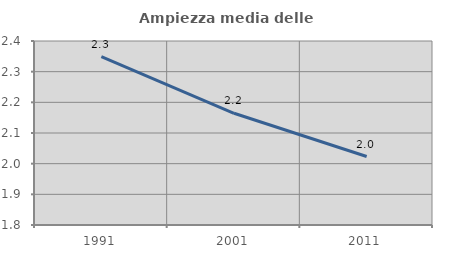
| Category | Ampiezza media delle famiglie |
|---|---|
| 1991.0 | 2.349 |
| 2001.0 | 2.164 |
| 2011.0 | 2.023 |